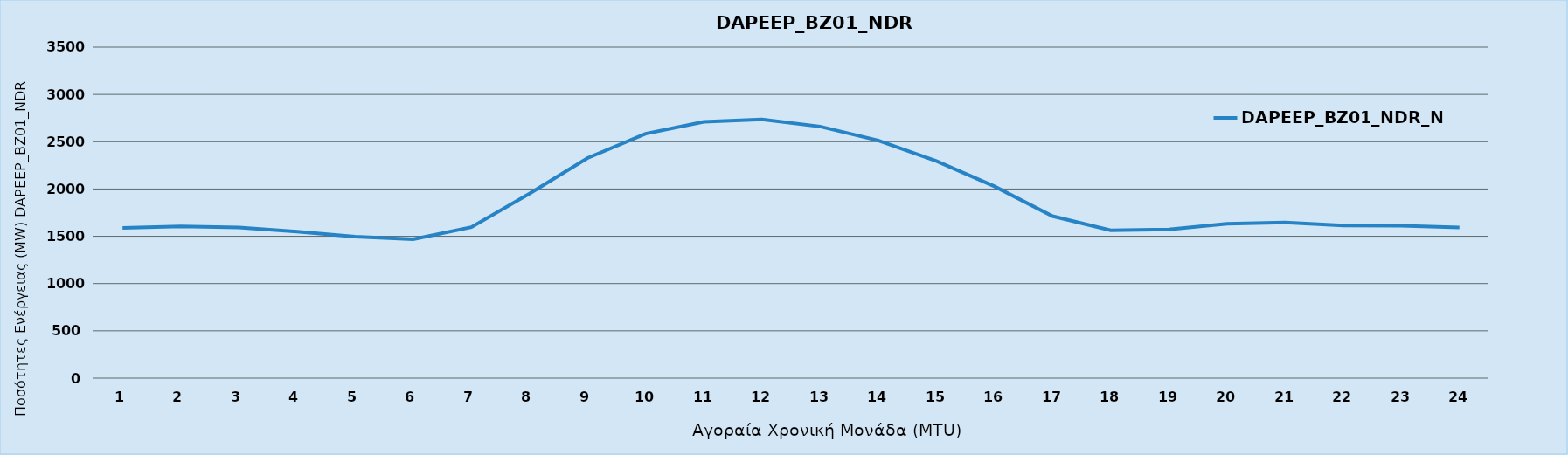
| Category | DAPEEP_BZ01_NDR_N1 |
|---|---|
| 0 | 1589 |
| 1 | 1604 |
| 2 | 1594 |
| 3 | 1550 |
| 4 | 1497 |
| 5 | 1469 |
| 6 | 1596 |
| 7 | 1951 |
| 8 | 2327 |
| 9 | 2585 |
| 10 | 2710 |
| 11 | 2735 |
| 12 | 2661 |
| 13 | 2513 |
| 14 | 2296 |
| 15 | 2028 |
| 16 | 1713 |
| 17 | 1563 |
| 18 | 1572 |
| 19 | 1633 |
| 20 | 1645 |
| 21 | 1614 |
| 22 | 1612 |
| 23 | 1592 |